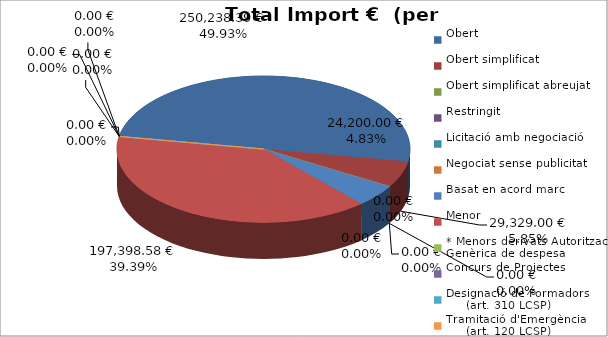
| Category | Total preu
(amb IVA) |
|---|---|
| Obert | 250238.394 |
| Obert simplificat | 29328.996 |
| Obert simplificat abreujat | 0 |
| Restringit | 0 |
| Licitació amb negociació | 0 |
| Negociat sense publicitat | 0 |
| Basat en acord marc | 24200 |
| Menor | 197398.577 |
| * Menors derivats Autorització Genèrica de despesa | 0 |
| Concurs de Projectes | 0 |
| Designació de Formadors
     (art. 310 LCSP) | 0 |
| Tramitació d'Emergència
     (art. 120 LCSP) | 0 |